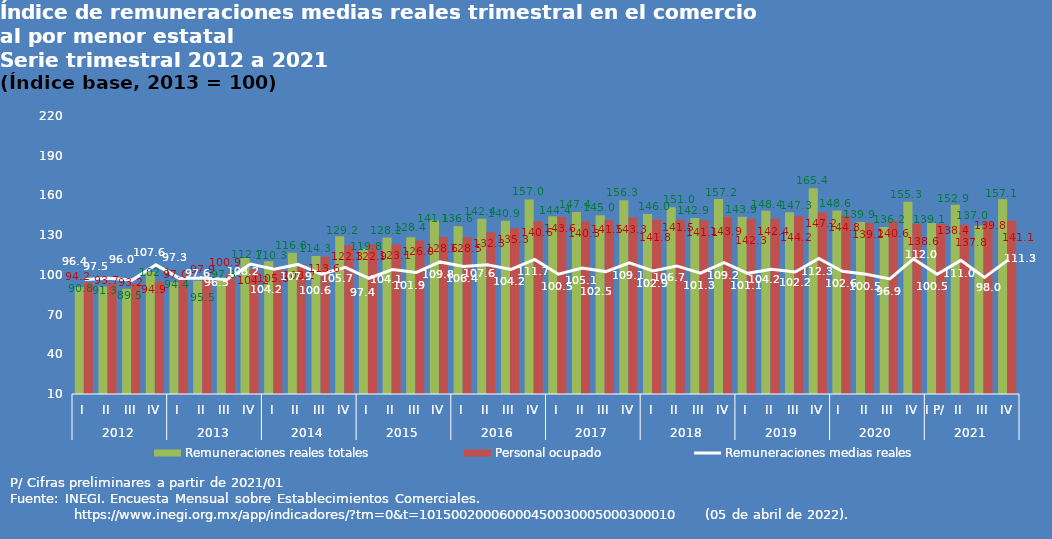
| Category | Remuneraciones reales totales | Personal ocupado |
|---|---|---|
| 0 | 90.771 | 94.152 |
| 1 | 91.278 | 93.657 |
| 2 | 89.495 | 93.19 |
| 3 | 102.118 | 94.937 |
| 4 | 94.392 | 96.999 |
| 5 | 95.548 | 97.923 |
| 6 | 97.334 | 100.86 |
| 7 | 112.726 | 104.218 |
| 8 | 110.3 | 105.831 |
| 9 | 116.76 | 108.227 |
| 10 | 114.282 | 113.584 |
| 11 | 129.22 | 122.288 |
| 12 | 119.77 | 122.928 |
| 13 | 128.195 | 123.138 |
| 14 | 128.365 | 126.007 |
| 15 | 141.141 | 128.575 |
| 16 | 136.638 | 128.471 |
| 17 | 142.391 | 132.344 |
| 18 | 140.878 | 135.258 |
| 19 | 157.014 | 140.573 |
| 20 | 144.36 | 143.635 |
| 21 | 147.413 | 140.254 |
| 22 | 144.962 | 141.482 |
| 23 | 156.297 | 143.291 |
| 24 | 145.996 | 141.834 |
| 25 | 150.998 | 141.466 |
| 26 | 142.879 | 141.057 |
| 27 | 157.246 | 143.945 |
| 28 | 143.907 | 142.278 |
| 29 | 148.385 | 142.37 |
| 30 | 147.289 | 144.177 |
| 31 | 165.351 | 147.181 |
| 32 | 148.611 | 144.781 |
| 33 | 139.898 | 139.228 |
| 34 | 136.217 | 140.59 |
| 35 | 155.287 | 138.611 |
| 36 | 139.1 | 138.4 |
| 37 | 152.926 | 137.812 |
| 38 | 137.044 | 139.817 |
| 39 | 157.101 | 141.148 |